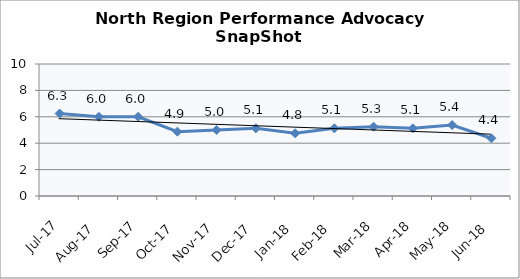
| Category | North Region |
|---|---|
| Jul-17 | 6.25 |
| Aug-17 | 6 |
| Sep-17 | 6 |
| Oct-17 | 4.875 |
| Nov-17 | 5 |
| Dec-17 | 5.125 |
| Jan-18 | 4.75 |
| Feb-18 | 5.125 |
| Mar-18 | 5.25 |
| Apr-18 | 5.125 |
| May-18 | 5.375 |
| Jun-18 | 4.375 |